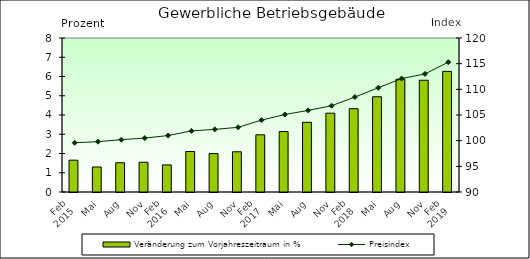
| Category | Veränderung zum Vorjahreszeitraum in % |
|---|---|
| 0 | 1.653 |
| 1 | 1.299 |
| 2 | 1.519 |
| 3 | 1.546 |
| 4 | 1.406 |
| 5 | 2.104 |
| 6 | 1.996 |
| 7 | 2.09 |
| 8 | 2.97 |
| 9 | 3.14 |
| 10 | 3.62 |
| 11 | 4.094 |
| 12 | 4.327 |
| 13 | 4.948 |
| 14 | 5.855 |
| 15 | 5.805 |
| 16 | 6.267 |